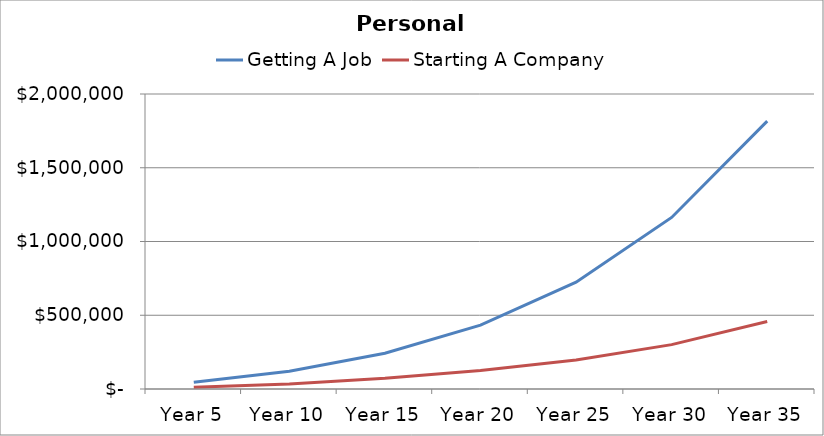
| Category | Getting A Job | Starting A Company |
|---|---|---|
| Year 5 | 45165.113 | 11838.932 |
| Year 10 | 120882.22 | 34535.669 |
| Year 15 | 242651.517 | 72360.824 |
| Year 20 | 432963.289 | 125375.885 |
| Year 25 | 724253.184 | 196119.184 |
| Year 30 | 1163056.963 | 300678.488 |
| Year 35 | 1815838.005 | 457078.806 |